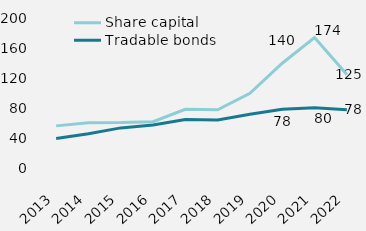
| Category | Share capital | Tradable bonds |
|---|---|---|
| 2013 | 56166.195 | 39353.473 |
| 2014 | 60415.364 | 45757.894 |
| 2015 | 60600.101 | 53480.796 |
| 2016 | 61779.331 | 57368.679 |
| 2017 | 78224.236 | 64765.974 |
| 2018 | 77649.356 | 64054.856 |
| 2019 | 99678.211 | 71567.221 |
| 2020 | 139674.291 | 78374.46 |
| 2021 | 173924.5 | 80327.277 |
| 2022 | 124615 | 77772 |